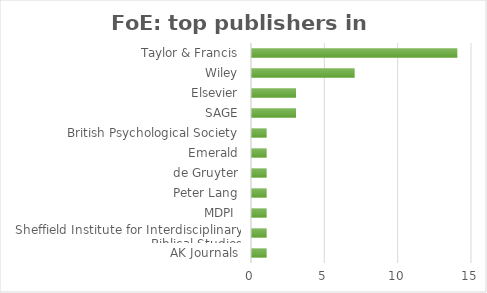
| Category | Series 0 |
|---|---|
| AK Journals | 1 |
| Sheffield Institute for Interdisciplinary Biblical Studies | 1 |
| MDPI  | 1 |
| Peter Lang | 1 |
| de Gruyter | 1 |
| Emerald | 1 |
| British Psychological Society | 1 |
| SAGE | 3 |
| Elsevier | 3 |
| Wiley | 7 |
| Taylor & Francis | 14 |